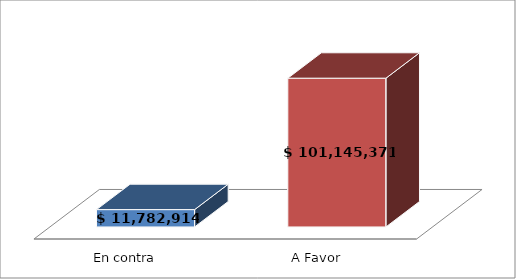
| Category | Series 0 |
|---|---|
| En contra  | 11782914 |
| A Favor  | 101145371 |